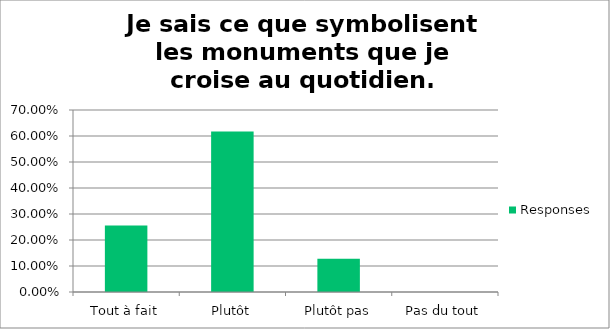
| Category | Responses |
|---|---|
| Tout à fait | 0.255 |
| Plutôt | 0.617 |
| Plutôt pas | 0.128 |
| Pas du tout | 0 |